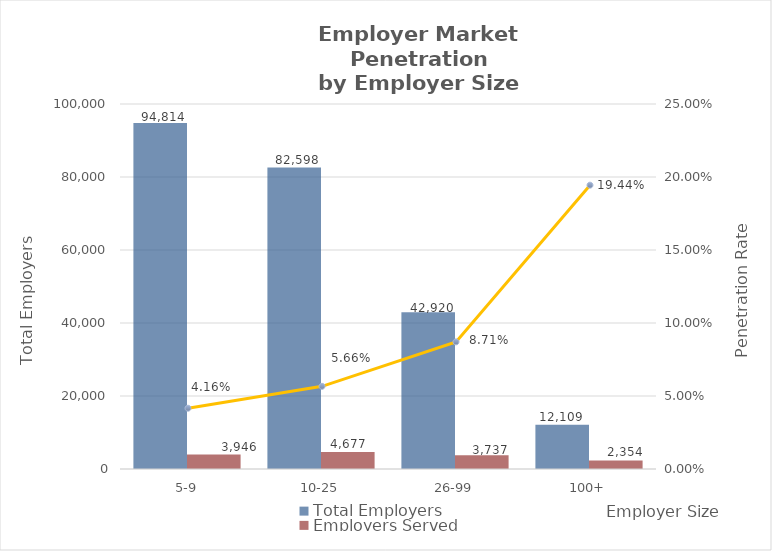
| Category | Total Employers | Employers Served |
|---|---|---|
| 5-9 | 94814 | 3946 |
| 10-25 | 82598 | 4677 |
| 26-99 | 42920 | 3737 |
| 100+ | 12109 | 2354 |